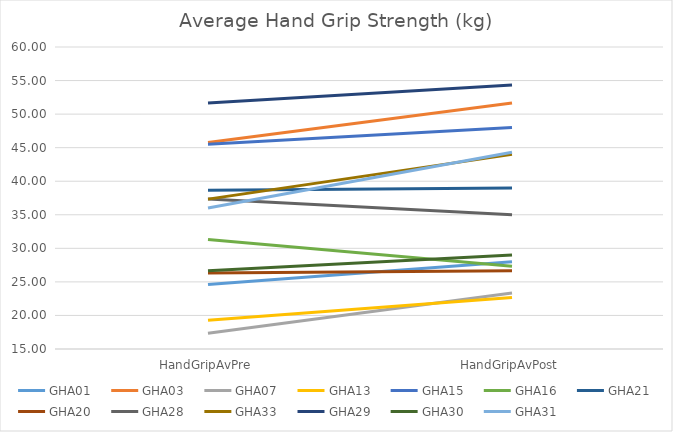
| Category | GHA01 | GHA03 | GHA07 | GHA13 | GHA15 | GHA16 | GHA21 | GHA20 | GHA28 | GHA33 | GHA29 | GHA30 | GHA31 |
|---|---|---|---|---|---|---|---|---|---|---|---|---|---|
| HandGripAvPre | 24.6 | 45.767 | 17.333 | 19.3 | 45.5 | 31.333 | 38.667 | 26.333 | 37.333 | 37.333 | 51.667 | 26.667 | 36 |
| HandGripAvPost | 28 | 51.667 | 23.333 | 22.667 | 48 | 27.333 | 39 | 26.667 | 35 | 44 | 54.33 | 29 | 44.33 |